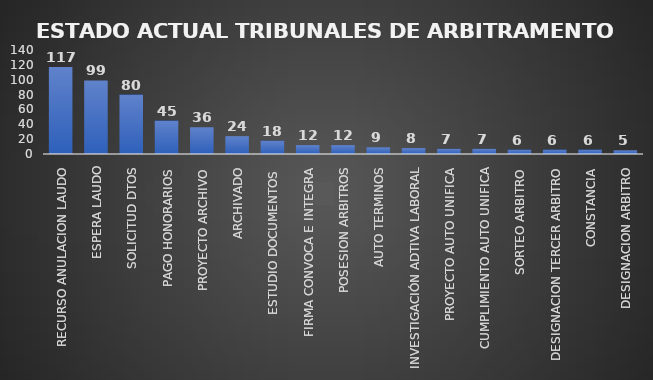
| Category | CANTIDAD | % |
|---|---|---|
| RECURSO ANULACION LAUDO | 117 | 0.246 |
| ESPERA LAUDO | 99 | 0.182 |
| SOLICITUD DTOS | 80 | 0.149 |
| PAGO HONORARIOS | 45 | 0.073 |
| PROYECTO ARCHIVO | 36 | 0.084 |
| ARCHIVADO | 24 | 0.044 |
| ESTUDIO DOCUMENTOS  | 18 | 0.04 |
| FIRMA CONVOCA E INTEGRA | 12 | 0.021 |
| POSESION ARBITROS | 12 | 0.021 |
| AUTO TERMINOS | 9 | 0.025 |
| INVESTIGACIÓN ADTIVA LABORAL | 8 | 0.014 |
| PROYECTO AUTO UNIFICA | 7 | 0.009 |
| CUMPLIMIENTO AUTO UNIFICA | 7 | 0.014 |
| SORTEO ARBITRO | 6 | 0.011 |
| DESIGNACION TERCER ARBITRO | 6 | 0.016 |
| CONSTANCIA | 6 | 0.015 |
| DESIGNACION ARBITRO | 5 | 0.012 |